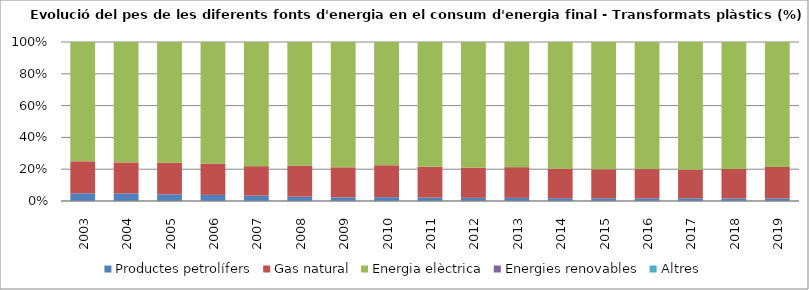
| Category | Productes petrolífers | Gas natural | Energia elèctrica | Energies renovables | Altres |
|---|---|---|---|---|---|
| 2003.0 | 7.6 | 31.54 | 117.75 | 0 | 0 |
| 2004.0 | 7.64 | 31.34 | 121.45 | 0 | 0 |
| 2005.0 | 6.79 | 32.12 | 122.44 | 0 | 0 |
| 2006.0 | 6.23 | 32.22 | 124.55 | 0 | 0 |
| 2007.0 | 5.4 | 29.97 | 126.07 | 0 | 0 |
| 2008.0 | 3.94 | 28.66 | 114.01 | 0 | 0 |
| 2009.0 | 2.74 | 23.05 | 95.9 | 0 | 0 |
| 2010.0 | 3.12 | 26.26 | 101.2 | 0 | 0 |
| 2011.0 | 2.71 | 25.05 | 101.07 | 0 | 0 |
| 2012.0 | 2.49 | 23.77 | 98.4 | 0.01 | 0 |
| 2013.0 | 2.49 | 24.37 | 99.22 | 0.01 | 0 |
| 2014.0 | 2.23 | 23.75 | 101.9 | 0.01 | 0 |
| 2015.0 | 2.28 | 23.95 | 105.22 | 0.01 | 0 |
| 2016.0 | 2.26 | 24.5 | 106.62 | 0.01 | 0 |
| 2017.0 | 2.37 | 24.84 | 110.85 | 0.01 | 0 |
| 2018.0 | 2.32 | 26.13 | 112.41 | 0.01 | 0 |
| 2019.0 | 2.36 | 28.24 | 112.13 | 0.01 | 0 |